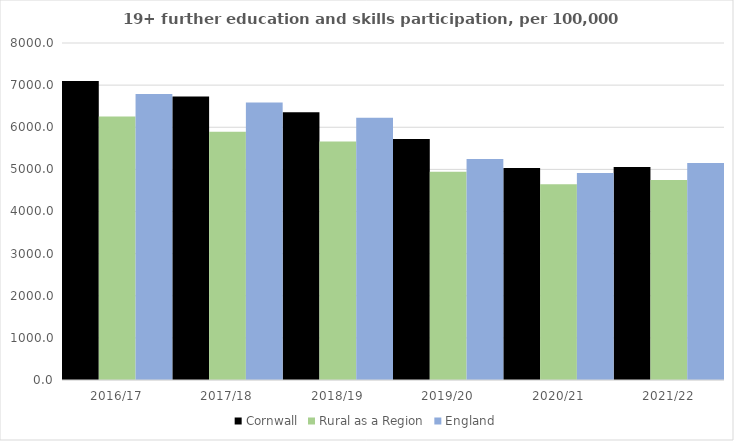
| Category | Cornwall | Rural as a Region | England |
|---|---|---|---|
| 2016/17 | 7097 | 6253.401 | 6788 |
| 2017/18 | 6732 | 5892.029 | 6588 |
| 2018/19 | 6358 | 5661.873 | 6227 |
| 2019/20 | 5722 | 4943.801 | 5244 |
| 2020/21 | 5030 | 4646.727 | 4913 |
| 2021/22 | 5056 | 4747.049 | 5151 |